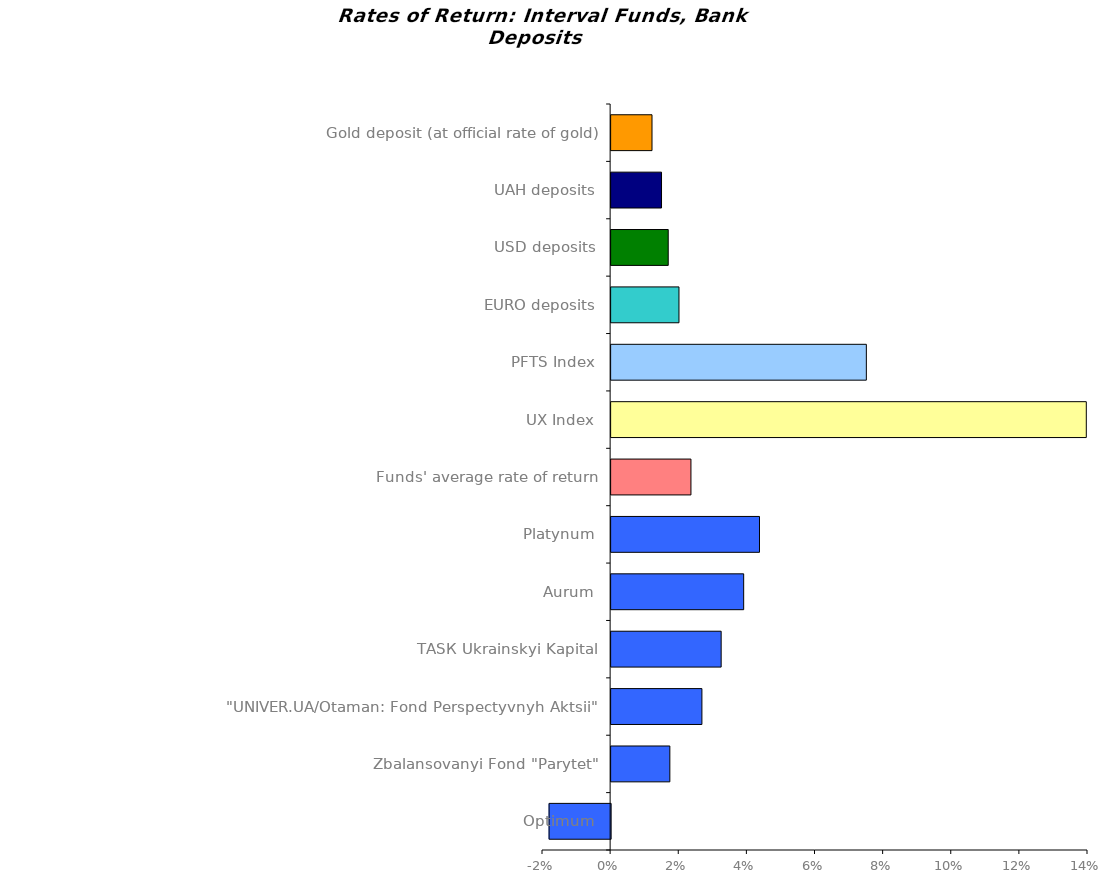
| Category | Series 0 |
|---|---|
| Optimum | -0.018 |
| Zbalansovanyi Fond "Parytet" | 0.017 |
| "UNIVER.UA/Otaman: Fond Perspectyvnyh Aktsii"  | 0.027 |
| ТАSК Ukrainskyi Kapital | 0.032 |
| Аurum | 0.039 |
| Platynum | 0.044 |
| Funds' average rate of return | 0.023 |
| UX Index | 0.14 |
| PFTS Index | 0.075 |
| EURO deposits | 0.02 |
| USD deposits | 0.017 |
| UAH deposits | 0.015 |
| Gold deposit (at official rate of gold) | 0.012 |